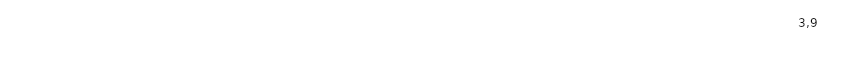
| Category | Итоговая оценка |
|---|---|
| Вопрос 2 | 3.9 |